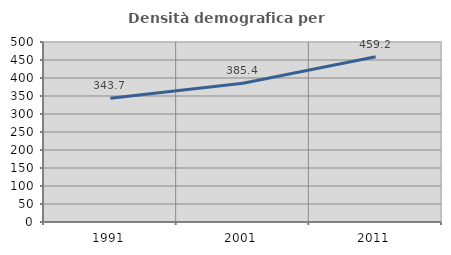
| Category | Densità demografica |
|---|---|
| 1991.0 | 343.656 |
| 2001.0 | 385.436 |
| 2011.0 | 459.151 |